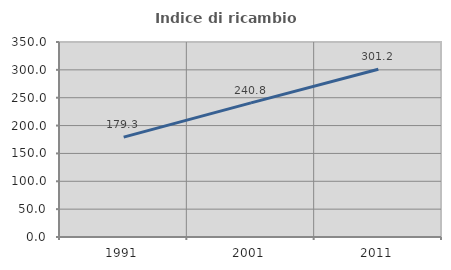
| Category | Indice di ricambio occupazionale  |
|---|---|
| 1991.0 | 179.268 |
| 2001.0 | 240.758 |
| 2011.0 | 301.163 |